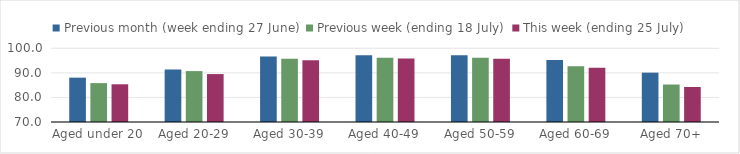
| Category | Previous month (week ending 27 June) | Previous week (ending 18 July) | This week (ending 25 July) |
|---|---|---|---|
| Aged under 20 | 88.048 | 85.823 | 85.351 |
| Aged 20-29 | 91.37 | 90.72 | 89.509 |
| Aged 30-39 | 96.614 | 95.694 | 95.082 |
| Aged 40-49 | 97.161 | 96.137 | 95.821 |
| Aged 50-59 | 97.178 | 96.178 | 95.738 |
| Aged 60-69 | 95.26 | 92.653 | 92.06 |
| Aged 70+ | 90.085 | 85.257 | 84.245 |